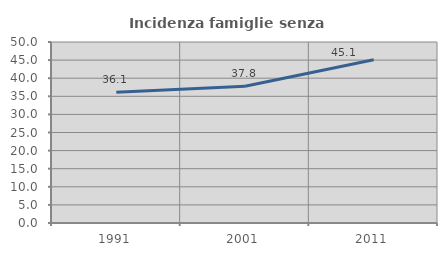
| Category | Incidenza famiglie senza nuclei |
|---|---|
| 1991.0 | 36.133 |
| 2001.0 | 37.801 |
| 2011.0 | 45.098 |